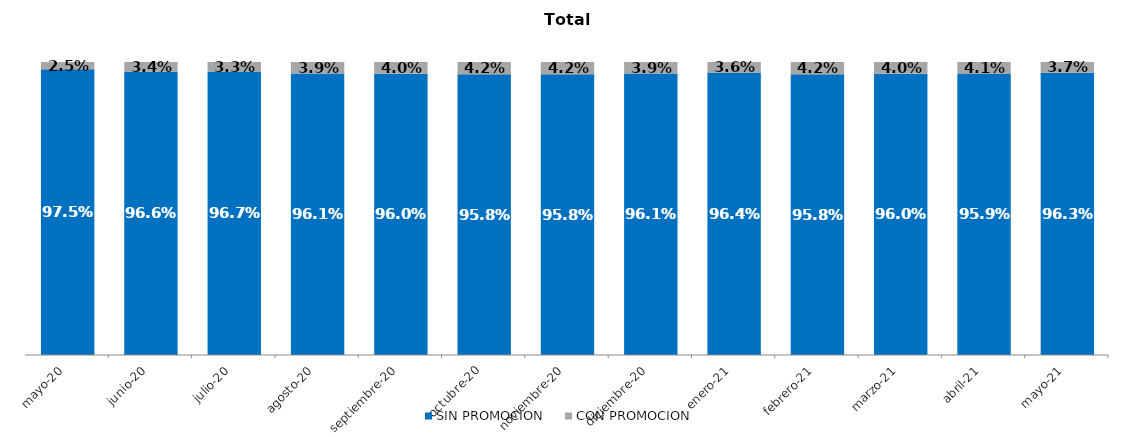
| Category | SIN PROMOCION   | CON PROMOCION   |
|---|---|---|
| 2020-05-01 | 0.975 | 0.025 |
| 2020-06-01 | 0.966 | 0.034 |
| 2020-07-01 | 0.967 | 0.033 |
| 2020-08-01 | 0.961 | 0.039 |
| 2020-09-01 | 0.96 | 0.04 |
| 2020-10-01 | 0.958 | 0.042 |
| 2020-11-01 | 0.958 | 0.042 |
| 2020-12-01 | 0.961 | 0.039 |
| 2021-01-01 | 0.964 | 0.036 |
| 2021-02-01 | 0.958 | 0.042 |
| 2021-03-01 | 0.96 | 0.04 |
| 2021-04-01 | 0.959 | 0.041 |
| 2021-05-01 | 0.963 | 0.037 |